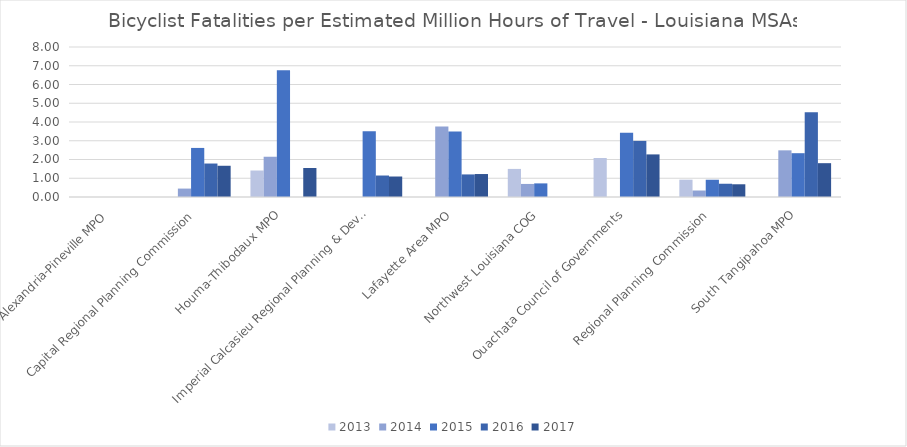
| Category | 2013 | 2014 | 2015 | 2016 | 2017 |
|---|---|---|---|---|---|
| Alexandria-Pineville MPO | 0 | 0 | 0 | 0 | 0 |
| Capital Regional Planning Commission | 0 | 0.449 | 2.617 | 1.785 | 1.666 |
| Houma-Thibodaux MPO | 1.413 | 2.147 | 6.765 | 0 | 1.547 |
| Imperial Calcasieu Regional Planning & Development Commission | 0 | 0 | 3.506 | 1.146 | 1.093 |
| Lafayette Area MPO | 0 | 3.754 | 3.492 | 1.204 | 1.225 |
| Northwest Louisiana COG | 1.498 | 0.697 | 0.726 | 0 | 0 |
| Ouachata Council of Governments | 2.079 | 0 | 3.43 | 2.992 | 2.272 |
| Regional Planning Commission | 0.923 | 0.346 | 0.921 | 0.707 | 0.679 |
| South Tangipahoa MPO | 0 | 2.488 | 2.336 | 4.519 | 1.804 |